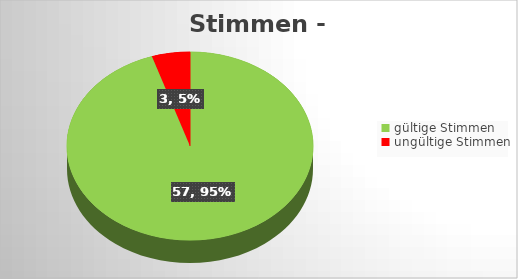
| Category | Series 0 |
|---|---|
| gültige Stimmen | 57 |
| ungültige Stimmen | 3 |